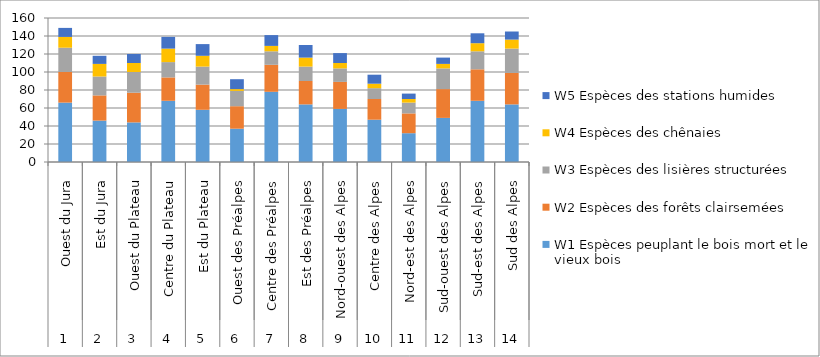
| Category | W1 Espèces peuplant le bois mort et le vieux bois | W2 Espèces des forêts clairsemées | W3 Espèces des lisières structurées | W4 Espèces des chênaies | W5 Espèces des stations humides |
|---|---|---|---|---|---|
| 0 | 66 | 34 | 27 | 12 | 10 |
| 1 | 46 | 28 | 21 | 14 | 9 |
| 2 | 44 | 33 | 23 | 10 | 10 |
| 3 | 68 | 26 | 17 | 15 | 13 |
| 4 | 58 | 28 | 20 | 12 | 13 |
| 5 | 37 | 25 | 17 | 2 | 11 |
| 6 | 78 | 30 | 15 | 6 | 12 |
| 7 | 64 | 26 | 16 | 10 | 14 |
| 8 | 59 | 30 | 15 | 6 | 11 |
| 9 | 47 | 23 | 12 | 5 | 10 |
| 10 | 32 | 22 | 12 | 4 | 6 |
| 11 | 49 | 32 | 23 | 5 | 7 |
| 12 | 68 | 35 | 20 | 9 | 11 |
| 13 | 64 | 35 | 27 | 10 | 9 |